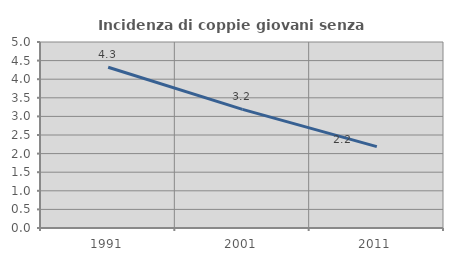
| Category | Incidenza di coppie giovani senza figli |
|---|---|
| 1991.0 | 4.32 |
| 2001.0 | 3.19 |
| 2011.0 | 2.188 |